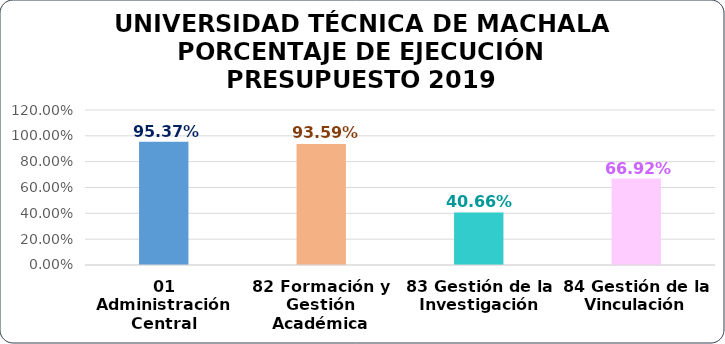
| Category | % EJECUCIÓN PRESUPUESTO |
|---|---|
| 01 Administración Central | 0.954 |
| 82 Formación y Gestión Académica | 0.936 |
| 83 Gestión de la Investigación | 0.407 |
| 84 Gestión de la Vinculación | 0.669 |